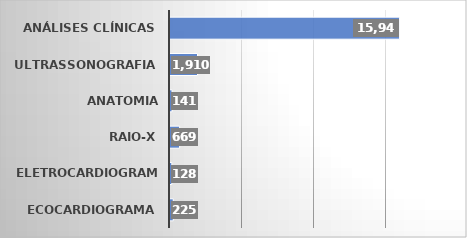
| Category | Series 0 |
|---|---|
| ECOCARDIOGRAMA | 225 |
| ELETROCARDIOGRAMA | 128 |
| RAIO-X | 669 |
| ANATOMIA PATOLÓGICA | 141 |
| ULTRASSONOGRAFIA | 1910 |
| ANÁLISES CLÍNICAS | 15945 |